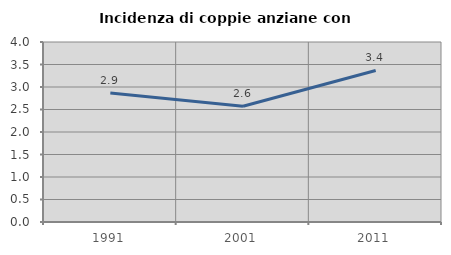
| Category | Incidenza di coppie anziane con figli |
|---|---|
| 1991.0 | 2.867 |
| 2001.0 | 2.572 |
| 2011.0 | 3.367 |